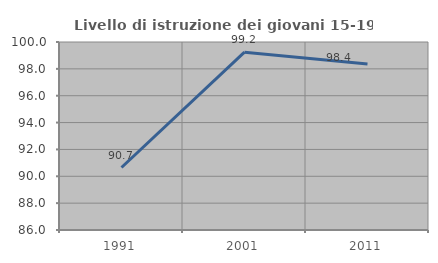
| Category | Livello di istruzione dei giovani 15-19 anni |
|---|---|
| 1991.0 | 90.654 |
| 2001.0 | 99.242 |
| 2011.0 | 98.361 |